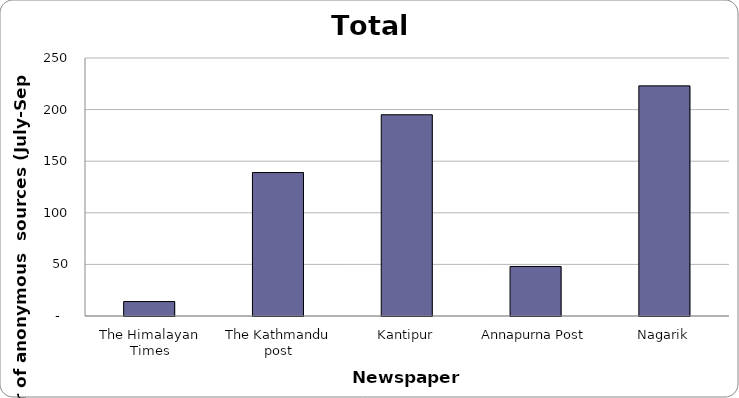
| Category | Series 0 |
|---|---|
| The Himalayan Times | 14 |
| The Kathmandu post | 139 |
| Kantipur | 195 |
| Annapurna Post | 48 |
| Nagarik | 223 |